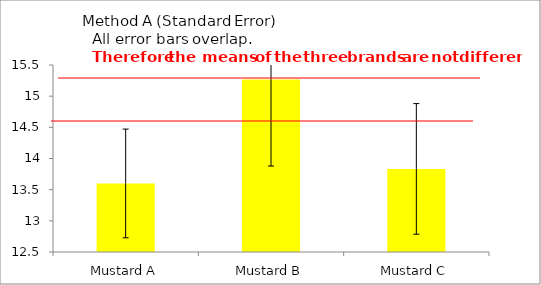
| Category | Series 0 |
|---|---|
| Mustard A | 13.6 |
| Mustard B | 15.267 |
| Mustard C | 13.833 |